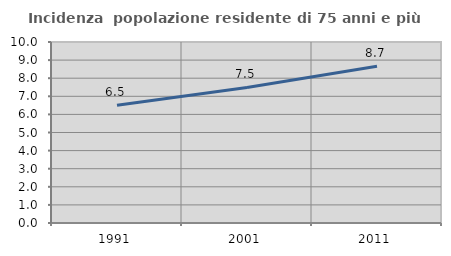
| Category | Incidenza  popolazione residente di 75 anni e più |
|---|---|
| 1991.0 | 6.509 |
| 2001.0 | 7.491 |
| 2011.0 | 8.656 |